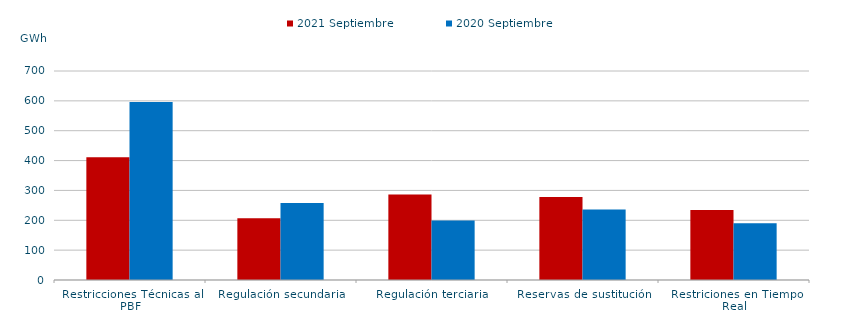
| Category | 2021 Septiembre | 2020 Septiembre |
|---|---|---|
| Restricciones Técnicas al PBF | 411.424 | 595.84 |
| Regulación secundaria | 206.746 | 257.717 |
| Regulación terciaria | 286.622 | 199.565 |
| Reservas de sustitución | 277.686 | 236.4 |
| Restriciones en Tiempo Real | 234.229 | 190.437 |